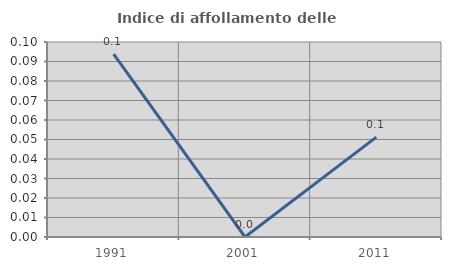
| Category | Indice di affollamento delle abitazioni  |
|---|---|
| 1991.0 | 0.094 |
| 2001.0 | 0 |
| 2011.0 | 0.051 |